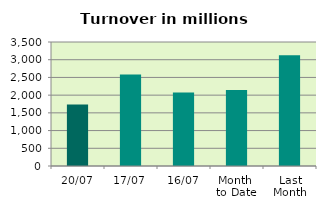
| Category | Series 0 |
|---|---|
| 20/07 | 1736.853 |
| 17/07 | 2581.673 |
| 16/07 | 2071.354 |
| Month 
to Date | 2143.285 |
| Last
Month | 3125.17 |